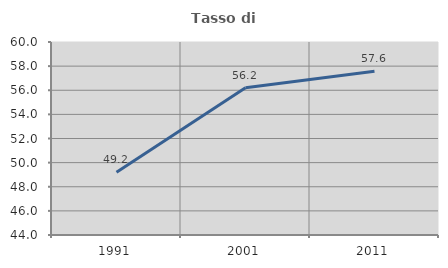
| Category | Tasso di occupazione   |
|---|---|
| 1991.0 | 49.2 |
| 2001.0 | 56.215 |
| 2011.0 | 57.567 |